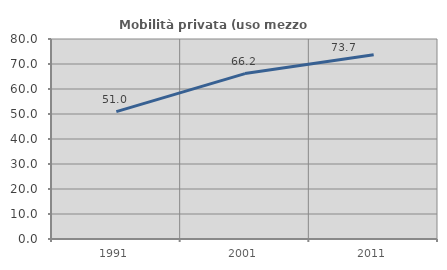
| Category | Mobilità privata (uso mezzo privato) |
|---|---|
| 1991.0 | 50.954 |
| 2001.0 | 66.158 |
| 2011.0 | 73.736 |